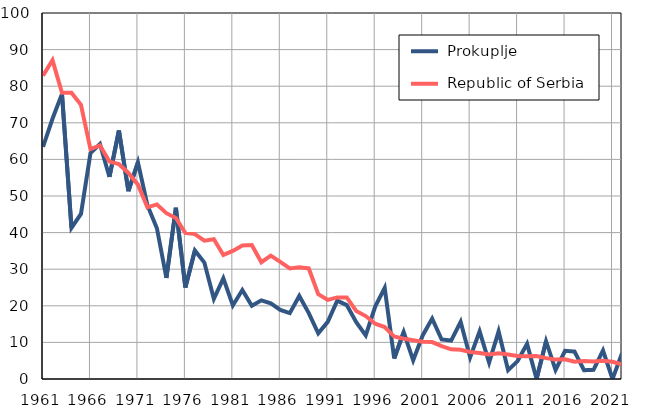
| Category |  Prokuplje |  Republic of Serbia |
|---|---|---|
| 1961.0 | 63.4 | 82.9 |
| 1962.0 | 71.1 | 87.1 |
| 1963.0 | 77.9 | 78.2 |
| 1964.0 | 41.3 | 78.2 |
| 1965.0 | 45.1 | 74.9 |
| 1966.0 | 61.7 | 62.8 |
| 1967.0 | 64.2 | 63.8 |
| 1968.0 | 55.2 | 59.4 |
| 1969.0 | 67.9 | 58.7 |
| 1970.0 | 51.3 | 56.3 |
| 1971.0 | 59.2 | 53.1 |
| 1972.0 | 47.5 | 46.9 |
| 1973.0 | 41.2 | 47.7 |
| 1974.0 | 27.6 | 45.3 |
| 1975.0 | 46.8 | 44 |
| 1976.0 | 25 | 39.9 |
| 1977.0 | 35.1 | 39.6 |
| 1978.0 | 31.8 | 37.8 |
| 1979.0 | 21.9 | 38.2 |
| 1980.0 | 27.5 | 33.9 |
| 1981.0 | 20.1 | 35 |
| 1982.0 | 24.3 | 36.5 |
| 1983.0 | 20 | 36.6 |
| 1984.0 | 21.5 | 31.9 |
| 1985.0 | 20.7 | 33.7 |
| 1986.0 | 18.9 | 32 |
| 1987.0 | 18 | 30.2 |
| 1988.0 | 22.7 | 30.5 |
| 1989.0 | 18 | 30.2 |
| 1990.0 | 12.5 | 23.2 |
| 1991.0 | 15.6 | 21.6 |
| 1992.0 | 21.4 | 22.3 |
| 1993.0 | 20.2 | 22.3 |
| 1994.0 | 15.5 | 18.6 |
| 1995.0 | 11.9 | 17.2 |
| 1996.0 | 19.8 | 15.1 |
| 1997.0 | 24.9 | 14.2 |
| 1998.0 | 5.6 | 11.6 |
| 1999.0 | 12.8 | 11 |
| 2000.0 | 5.1 | 10.6 |
| 2001.0 | 11.9 | 10.2 |
| 2002.0 | 16.5 | 10.1 |
| 2003.0 | 10.8 | 9 |
| 2004.0 | 10.5 | 8.1 |
| 2005.0 | 15.6 | 8 |
| 2006.0 | 5.9 | 7.4 |
| 2007.0 | 13 | 7.1 |
| 2008.0 | 4.5 | 6.7 |
| 2009.0 | 13 | 7 |
| 2010.0 | 2.4 | 6.7 |
| 2011.0 | 4.9 | 6.3 |
| 2012.0 | 9.6 | 6.2 |
| 2013.0 | 0 | 6.3 |
| 2014.0 | 10.3 | 5.7 |
| 2015.0 | 2.5 | 5.3 |
| 2016.0 | 7.7 | 5.4 |
| 2017.0 | 7.5 | 4.7 |
| 2018.0 | 2.4 | 4.9 |
| 2019.0 | 2.5 | 4.8 |
| 2020.0 | 7.8 | 5 |
| 2021.0 | 0 | 4.7 |
| 2022.0 | 7 | 4 |